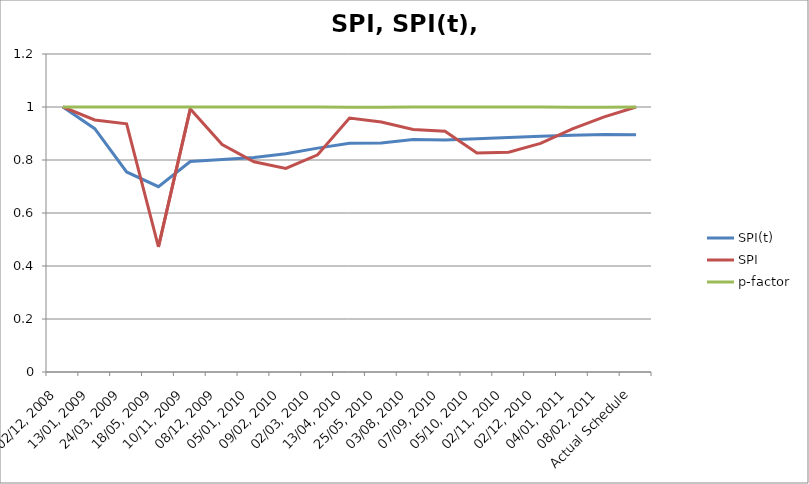
| Category | SPI(t) | SPI | p-factor |
|---|---|---|---|
| 02/12, 2008 | 1 | 1 | 1 |
| 13/01, 2009 | 0.918 | 0.951 | 1 |
| 24/03, 2009 | 0.755 | 0.936 | 1 |
| 18/05, 2009 | 0.699 | 0.472 | 1 |
| 10/11, 2009 | 0.794 | 0.993 | 1 |
| 08/12, 2009 | 0.802 | 0.859 | 1 |
| 05/01, 2010 | 0.81 | 0.793 | 1 |
| 09/02, 2010 | 0.824 | 0.768 | 1 |
| 02/03, 2010 | 0.845 | 0.82 | 1 |
| 13/04, 2010 | 0.863 | 0.959 | 0.999 |
| 25/05, 2010 | 0.864 | 0.943 | 0.999 |
| 03/08, 2010 | 0.877 | 0.915 | 1 |
| 07/09, 2010 | 0.876 | 0.908 | 1 |
| 05/10, 2010 | 0.88 | 0.826 | 1 |
| 02/11, 2010 | 0.885 | 0.829 | 1 |
| 02/12, 2010 | 0.889 | 0.862 | 1 |
| 04/01, 2011 | 0.893 | 0.917 | 0.999 |
| 08/02, 2011 | 0.896 | 0.963 | 0.999 |
| Actual Schedule | 0.895 | 1 | 1 |